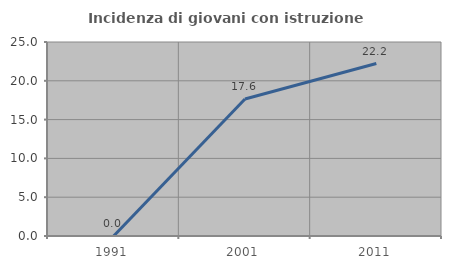
| Category | Incidenza di giovani con istruzione universitaria |
|---|---|
| 1991.0 | 0 |
| 2001.0 | 17.647 |
| 2011.0 | 22.222 |